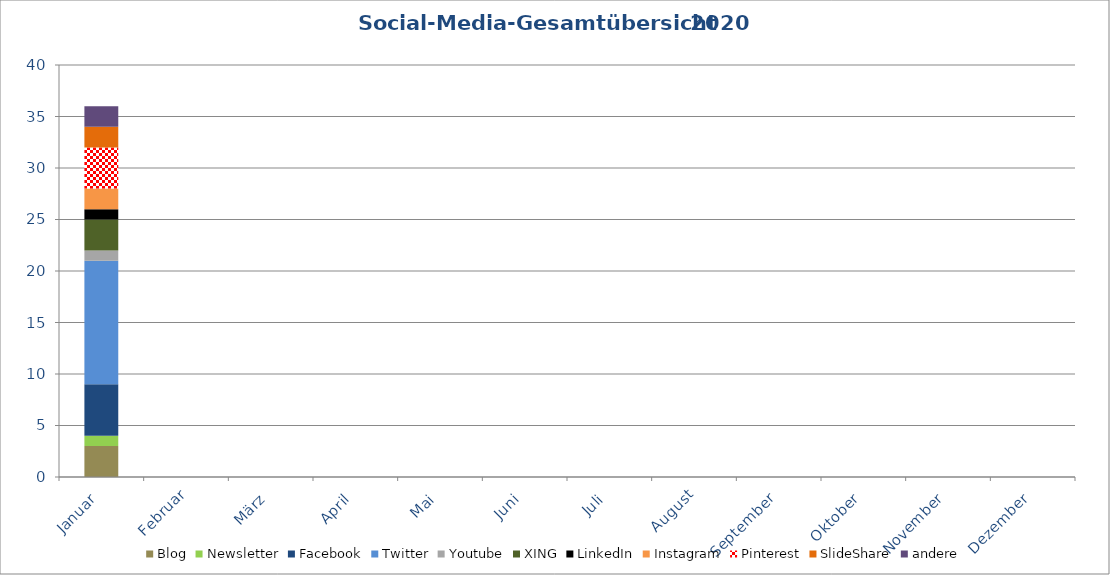
| Category | Blog | Newsletter | Facebook | Twitter | Youtube | XING | LinkedIn | Instagram | Pinterest | SlideShare | andere |
|---|---|---|---|---|---|---|---|---|---|---|---|
| Januar | 3 | 1 | 5 | 12 | 1 | 3 | 1 | 2 | 4 | 2 | 2 |
| Februar | 0 | 0 | 0 | 0 | 0 | 0 | 0 | 0 | 0 | 0 | 0 |
| März | 0 | 0 | 0 | 0 | 0 | 0 | 0 | 0 | 0 | 0 | 0 |
| April | 0 | 0 | 0 | 0 | 0 | 0 | 0 | 0 | 0 | 0 | 0 |
| Mai | 0 | 0 | 0 | 0 | 0 | 0 | 0 | 0 | 0 | 0 | 0 |
| Juni | 0 | 0 | 0 | 0 | 0 | 0 | 0 | 0 | 0 | 0 | 0 |
| Juli | 0 | 0 | 0 | 0 | 0 | 0 | 0 | 0 | 0 | 0 | 0 |
| August | 0 | 0 | 0 | 0 | 0 | 0 | 0 | 0 | 0 | 0 | 0 |
| September | 0 | 0 | 0 | 0 | 0 | 0 | 0 | 0 | 0 | 0 | 0 |
| Oktober | 0 | 0 | 0 | 0 | 0 | 0 | 0 | 0 | 0 | 0 | 0 |
| November | 0 | 0 | 0 | 0 | 0 | 0 | 0 | 0 | 0 | 0 | 0 |
| Dezember | 0 | 0 | 0 | 0 | 0 | 0 | 0 | 0 | 0 | 0 | 0 |